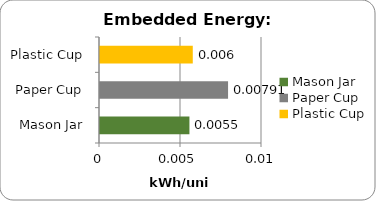
| Category | Series 0 |
|---|---|
| Mason Jar | 0.006 |
| Paper Cup | 0.008 |
| Plastic Cup | 0.006 |